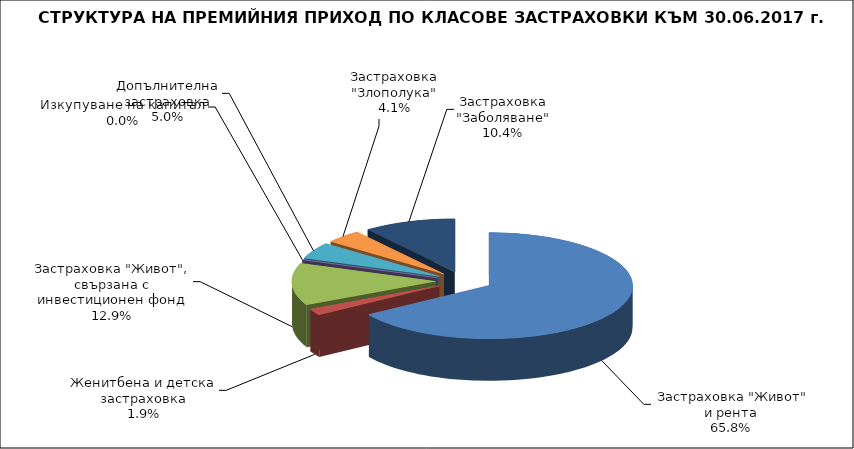
| Category |  Застраховка "Живот" и рента |
|---|---|
|  Застраховка "Живот" и рента | 155413751.642 |
| Женитбена и детска застраховка | 4584830.58 |
| Застраховка "Живот", свързана с инвестиционен фонд | 30385572.516 |
| Изкупуване на капитал | 0 |
| Допълнителна застраховка | 11791947.384 |
| Застраховка "Злополука" | 9649430.243 |
| Застраховка "Заболяване" | 24519616.202 |